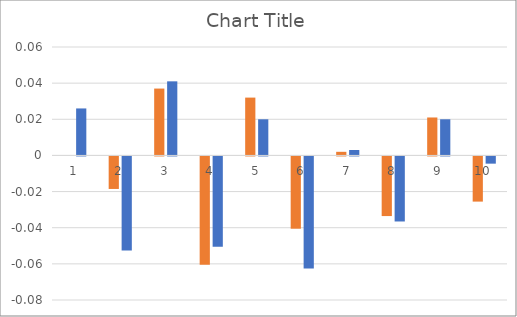
| Category | Series 1 | Series 0 |
|---|---|---|
| 0 | 0 | 0.026 |
| 1 | -0.018 | -0.052 |
| 2 | 0.037 | 0.041 |
| 3 | -0.06 | -0.05 |
| 4 | 0.032 | 0.02 |
| 5 | -0.04 | -0.062 |
| 6 | 0.002 | 0.003 |
| 7 | -0.033 | -0.036 |
| 8 | 0.021 | 0.02 |
| 9 | -0.025 | -0.004 |